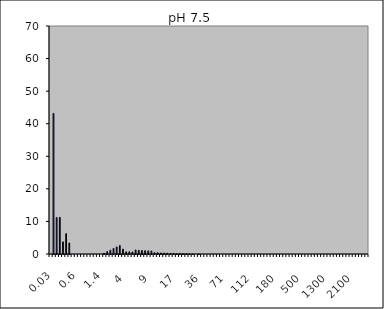
| Category | Magnetite pH 7,5 1Nb |
|---|---|
| 0.03 | 0 |
| 0.04 | 43.161 |
| 0.07 | 11.174 |
| 0.1 | 11.264 |
| 0.2 | 3.72 |
| 0.3 | 6.245 |
| 0.4 | 3.381 |
| 0.5 | 0 |
| 0.6 | 0 |
| 0.7 | 0 |
| 0.8 | 0 |
| 0.9 | 0 |
| 1.0 | 0 |
| 1.1 | 0 |
| 1.2 | 0 |
| 1.3 | 0 |
| 1.4 | 0 |
| 1.6 | 0.208 |
| 1.8 | 0.734 |
| 2.0 | 1.172 |
| 2.2 | 1.685 |
| 2.4 | 2.165 |
| 2.6 | 2.623 |
| 3.0 | 1.489 |
| 4.0 | 0.644 |
| 5.0 | 0.678 |
| 6.0 | 0.61 |
| 6.5 | 1.235 |
| 7.0 | 1.125 |
| 7.5 | 1.074 |
| 8.0 | 1.005 |
| 8.5 | 0.968 |
| 9.0 | 0.918 |
| 10.0 | 0.41 |
| 11.0 | 0.389 |
| 12.0 | 0.319 |
| 13.0 | 0.309 |
| 14.0 | 0.25 |
| 15.0 | 0.224 |
| 16.0 | 0.191 |
| 17.0 | 0.153 |
| 18.0 | 0.162 |
| 19.0 | 0.114 |
| 20.0 | 0.12 |
| 22.0 | 0.032 |
| 25.0 | 0.024 |
| 28.0 | 0 |
| 32.0 | 0.023 |
| 36.0 | 0 |
| 38.0 | 0 |
| 40.0 | 0 |
| 45.0 | 0 |
| 50.0 | 0 |
| 53.0 | 0 |
| 56.0 | 0 |
| 63.0 | 0 |
| 71.0 | 0 |
| 75.0 | 0 |
| 80.0 | 0 |
| 85.0 | 0 |
| 90.0 | 0 |
| 95.0 | 0 |
| 100.0 | 0 |
| 106.0 | 0 |
| 112.0 | 0 |
| 125.0 | 0 |
| 130.0 | 0 |
| 140.0 | 0 |
| 145.0 | 0 |
| 150.0 | 0 |
| 160.0 | 0 |
| 170.0 | 0 |
| 180.0 | 0 |
| 190.0 | 0 |
| 200.0 | 0 |
| 212.0 | 0 |
| 242.0 | 0 |
| 250.0 | 0 |
| 300.0 | 0 |
| 400.0 | 0 |
| 500.0 | 0 |
| 600.0 | 0 |
| 700.0 | 0 |
| 800.0 | 0 |
| 900.0 | 0 |
| 1000.0 | 0 |
| 1100.0 | 0 |
| 1200.0 | 0 |
| 1300.0 | 0 |
| 1400.0 | 0 |
| 1500.0 | 0 |
| 1600.0 | 0 |
| 1700.0 | 0 |
| 1800.0 | 0 |
| 1900.0 | 0 |
| 2000.0 | 0 |
| 2100.0 | 0 |
| 2200.0 | 0 |
| 2300.0 | 0 |
| 2400.0 | 0 |
| 2500.0 | 0 |